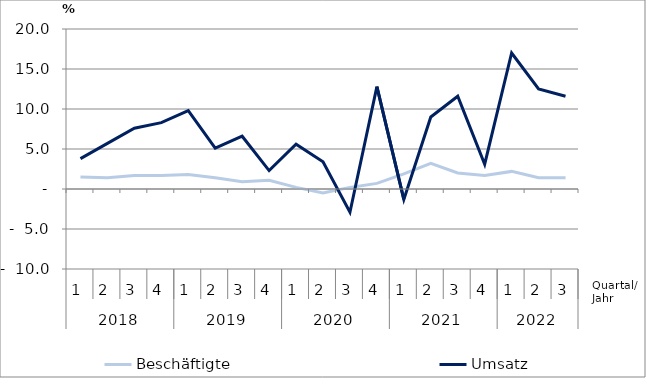
| Category | Beschäftigte | Umsatz |
|---|---|---|
| 0 | 1.5 | 3.8 |
| 1 | 1.4 | 5.7 |
| 2 | 1.7 | 7.6 |
| 3 | 1.7 | 8.3 |
| 4 | 1.8 | 9.8 |
| 5 | 1.4 | 5.1 |
| 6 | 0.9 | 6.6 |
| 7 | 1.1 | 2.3 |
| 8 | 0.2 | 5.6 |
| 9 | -0.5 | 3.4 |
| 10 | 0.2 | -2.9 |
| 11 | 0.7 | 12.8 |
| 12 | 1.9 | -1.3 |
| 13 | 3.2 | 9 |
| 14 | 2 | 11.6 |
| 15 | 1.7 | 3.1 |
| 16 | 2.2 | 17 |
| 17 | 1.4 | 12.5 |
| 18 | 1.4 | 11.6 |